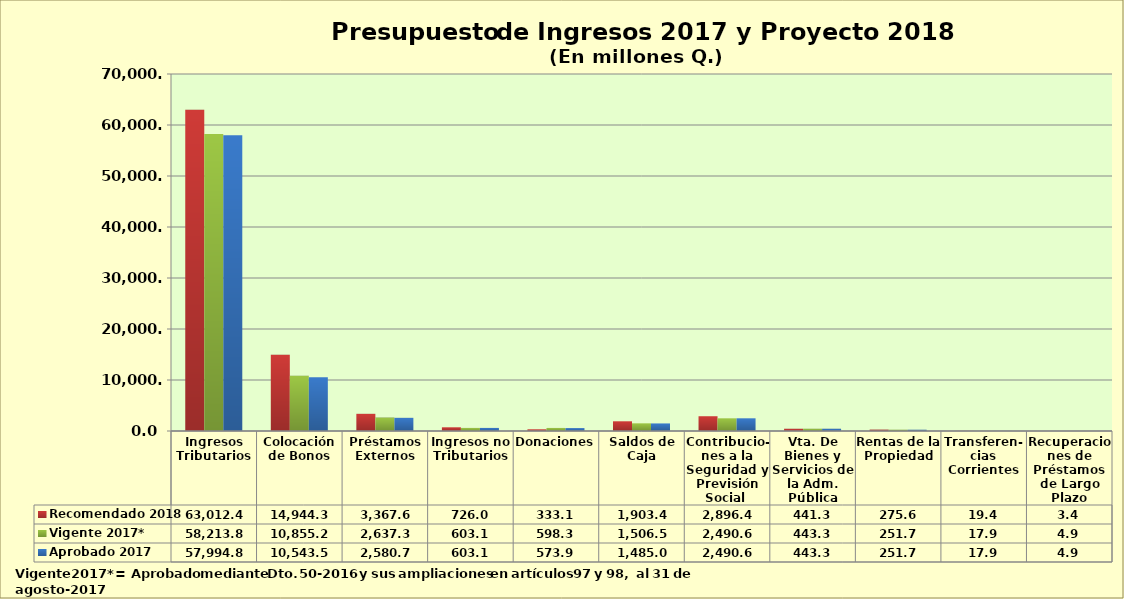
| Category | Recomendado 2018 | Vigente 2017* | Aprobado 2017 |
|---|---|---|---|
| Ingresos Tributarios | 63012.4 | 58213.8 | 57994.8 |
| Colocación de Bonos | 14944.3 | 10855.2 | 10543.5 |
| Préstamos Externos | 3367.6 | 2637.3 | 2580.7 |
| Ingresos no Tributarios | 726 | 603.1 | 603.1 |
| Donaciones | 333.1 | 598.3 | 573.9 |
| Saldos de Caja | 1903.4 | 1506.5 | 1485 |
| Contribucio-nes a la Seguridad y Previsión Social  | 2896.4 | 2490.6 | 2490.6 |
| Vta. De Bienes y Servicios de la Adm. Pública | 441.3 | 443.3 | 443.3 |
| Rentas de la Propiedad | 275.6 | 251.7 | 251.7 |
| Transferen-cias Corrientes | 19.4 | 17.9 | 17.9 |
| Recuperaciones de Préstamos de Largo Plazo | 3.4 | 4.9 | 4.9 |